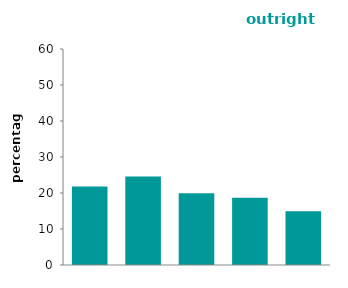
| Category | outright owners |
|---|---|
| quintile 1 (lowest) | 21.788 |
| quintile 2 | 24.613 |
| quintile 3 | 19.957 |
| quintile 4 | 18.692 |
| quintile 5 (highest) | 14.95 |